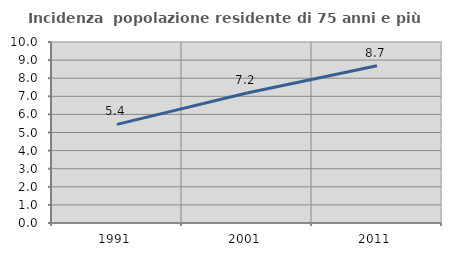
| Category | Incidenza  popolazione residente di 75 anni e più |
|---|---|
| 1991.0 | 5.448 |
| 2001.0 | 7.186 |
| 2011.0 | 8.685 |